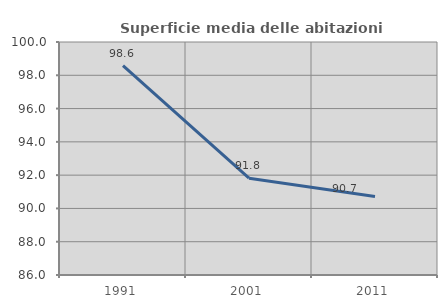
| Category | Superficie media delle abitazioni occupate |
|---|---|
| 1991.0 | 98.585 |
| 2001.0 | 91.818 |
| 2011.0 | 90.717 |